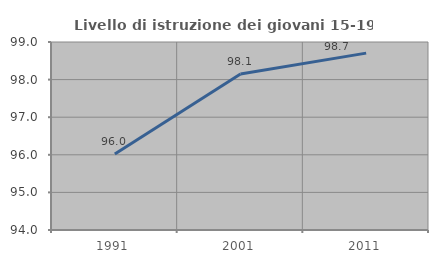
| Category | Livello di istruzione dei giovani 15-19 anni |
|---|---|
| 1991.0 | 96.02 |
| 2001.0 | 98.148 |
| 2011.0 | 98.704 |